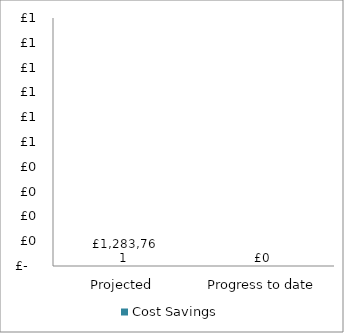
| Category | Cost Savings |
|---|---|
| 0 | 0 |
| 1 | 0 |